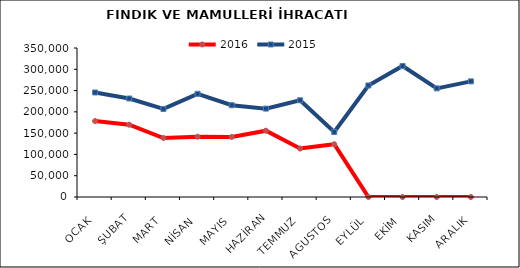
| Category | 2016 | 2015 |
|---|---|---|
| OCAK | 178413.554 | 245531.103 |
| ŞUBAT | 169776.462 | 231388.246 |
| MART | 138571.215 | 206870.614 |
| NİSAN | 141658.272 | 242419.208 |
| MAYIS | 140964.309 | 215601.546 |
| HAZİRAN | 155748.534 | 207594.191 |
| TEMMUZ | 113786.195 | 227181.933 |
| AGUSTOS | 123912.655 | 152733.692 |
| EYLÜL | 0 | 261985.311 |
| EKİM | 0 | 307824.415 |
| KASIM | 0 | 255191.82 |
| ARALIK | 0 | 271613.693 |